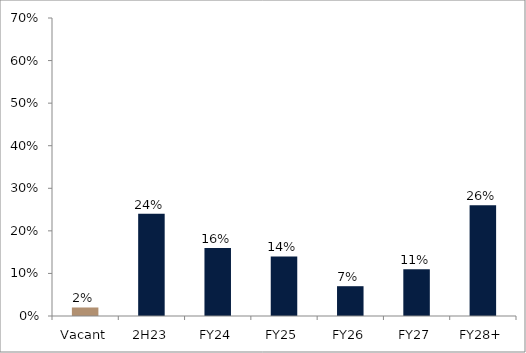
| Category | Series 0 |
|---|---|
| Vacant | 0.02 |
| 2H23 | 0.24 |
| FY24 | 0.16 |
| FY25 | 0.14 |
| FY26 | 0.07 |
| FY27 | 0.11 |
| FY28+ | 0.26 |